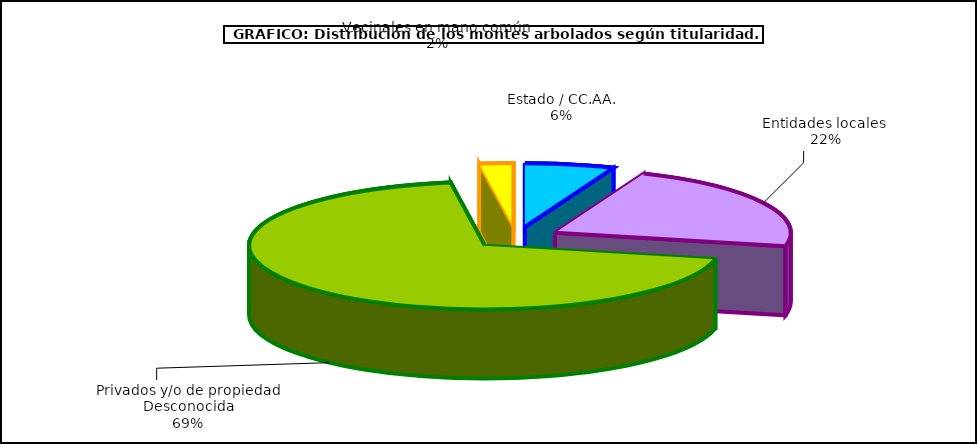
| Category | Series 0 |
|---|---|
| Estado / CC.AA. | 1135689.245 |
| Entidades locales  | 4119570.51 |
| Privados y/o de propiedad Desconocida | 12831165.073 |
| Vecinales en mano común  | 428471.925 |